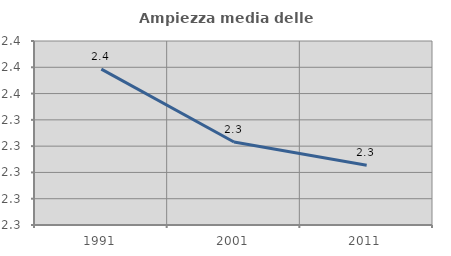
| Category | Ampiezza media delle famiglie |
|---|---|
| 1991.0 | 2.379 |
| 2001.0 | 2.323 |
| 2011.0 | 2.306 |